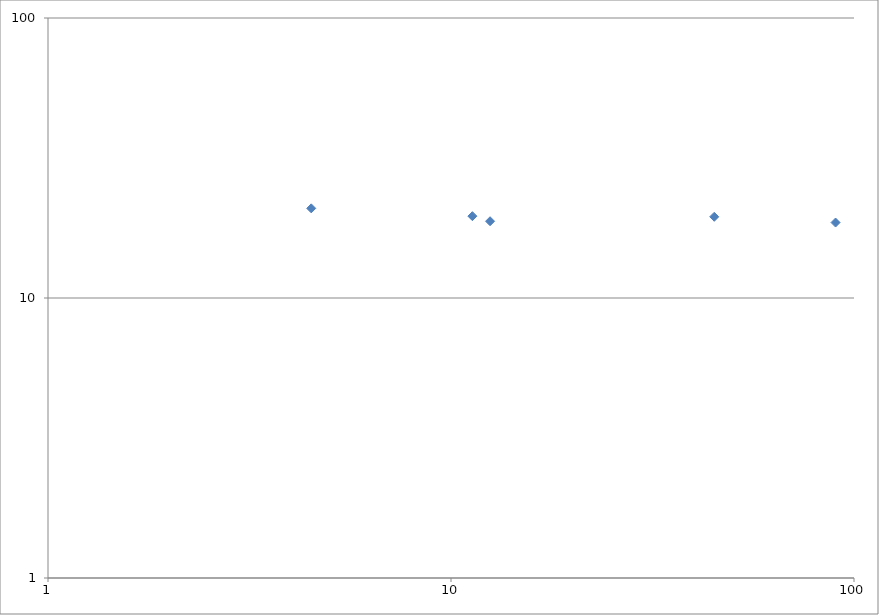
| Category | Series 0 |
|---|---|
| 4.5 | 20.9 |
| 11.3 | 19.6 |
| 12.5 | 18.8 |
| 45.0 | 19.5 |
| 90.0 | 18.6 |